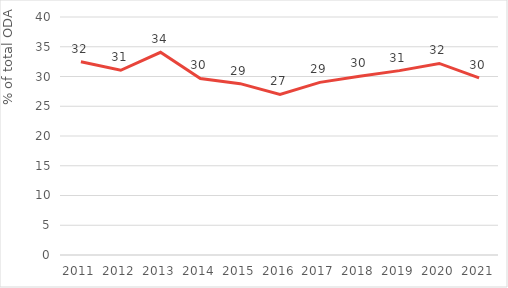
| Category | Series 0 |
|---|---|
| 2011.0 | 32.468 |
| 2012.0 | 31.049 |
| 2013.0 | 34.072 |
| 2014.0 | 29.666 |
| 2015.0 | 28.798 |
| 2016.0 | 26.999 |
| 2017.0 | 29.013 |
| 2018.0 | 30.051 |
| 2019.0 | 30.987 |
| 2020.0 | 32.193 |
| 2021.0 | 29.774 |